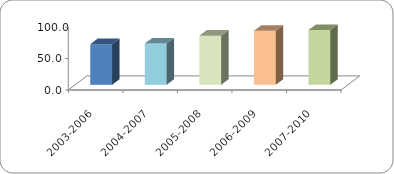
| Category | TITULACIÓN POR GENERACIÓN |
|---|---|
| 2003-2006 | 64.561 |
| 2004-2007 | 65.6 |
| 2005-2008 | 78.156 |
| 2006-2009 | 85.884 |
| 2007-2010 | 87.011 |